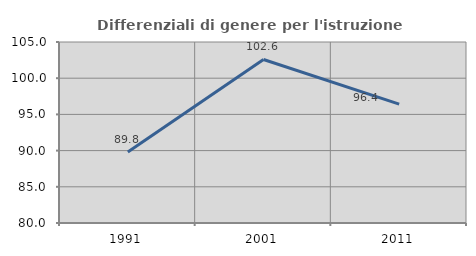
| Category | Differenziali di genere per l'istruzione superiore |
|---|---|
| 1991.0 | 89.81 |
| 2001.0 | 102.589 |
| 2011.0 | 96.425 |